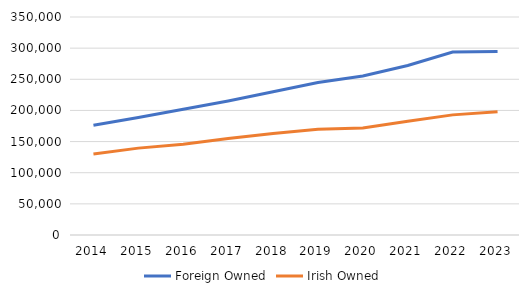
| Category | Foreign Owned | Irish Owned |
|---|---|---|
| 2014.0 | 176182 | 130049 |
| 2015.0 | 188530 | 139475 |
| 2016.0 | 201839 | 145791 |
| 2017.0 | 215161 | 155010 |
| 2018.0 | 229858 | 163029 |
| 2019.0 | 244936 | 169766 |
| 2020.0 | 255404 | 171637 |
| 2021.0 | 272163 | 182619 |
| 2022.0 | 293653 | 192861 |
| 2023.0 | 294471 | 197849 |